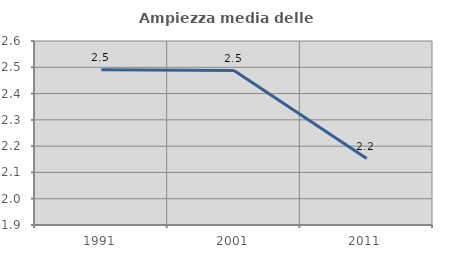
| Category | Ampiezza media delle famiglie |
|---|---|
| 1991.0 | 2.491 |
| 2001.0 | 2.488 |
| 2011.0 | 2.153 |